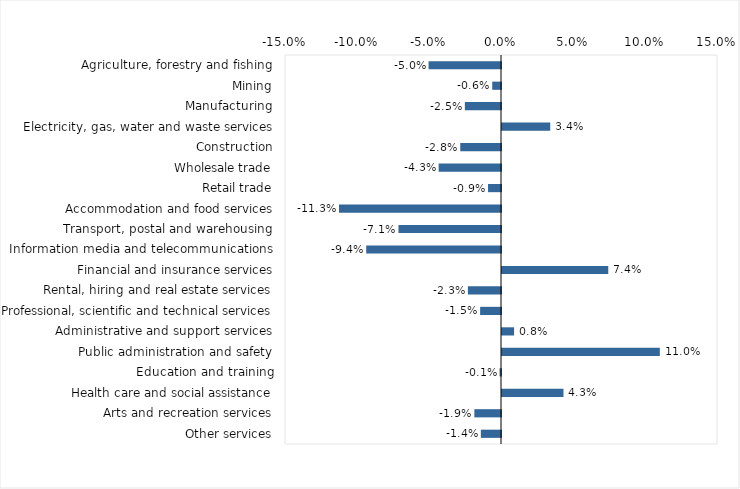
| Category | This week |
|---|---|
| Agriculture, forestry and fishing | -0.05 |
| Mining | -0.006 |
| Manufacturing | -0.025 |
| Electricity, gas, water and waste services | 0.034 |
| Construction | -0.028 |
| Wholesale trade | -0.043 |
| Retail trade | -0.009 |
| Accommodation and food services | -0.112 |
| Transport, postal and warehousing | -0.071 |
| Information media and telecommunications | -0.094 |
| Financial and insurance services | 0.074 |
| Rental, hiring and real estate services | -0.023 |
| Professional, scientific and technical services | -0.014 |
| Administrative and support services | 0.008 |
| Public administration and safety | 0.11 |
| Education and training | -0.001 |
| Health care and social assistance | 0.043 |
| Arts and recreation services | -0.018 |
| Other services | -0.014 |